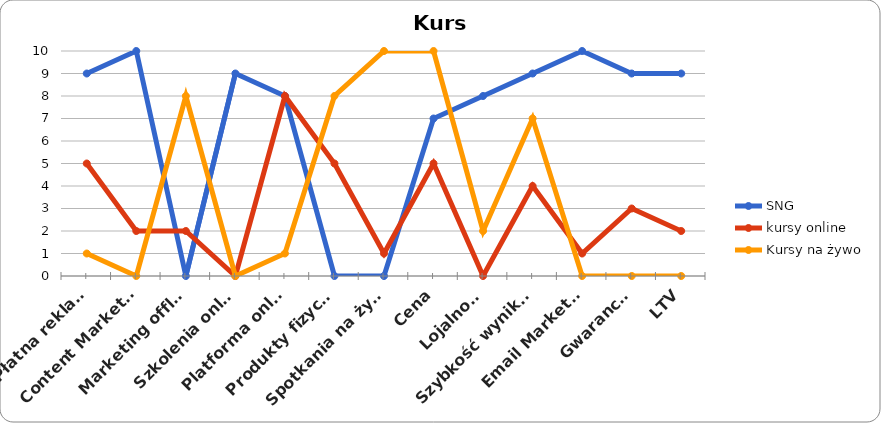
| Category | SNG | kursy online | Kursy na żywo |
|---|---|---|---|
| Płatna reklama | 9 | 5 | 1 |
| Content Marketing | 10 | 2 | 0 |
| Marketing offline | 0 | 2 | 8 |
| Szkolenia online | 9 | 0 | 0 |
| Platforma online | 8 | 8 | 1 |
| Produkty fizyczne | 0 | 5 | 8 |
| Spotkania na żywo | 0 | 1 | 10 |
| Cena | 7 | 5 | 10 |
| Lojalność | 8 | 0 | 2 |
| Szybkość wyników | 9 | 4 | 7 |
| Email Marketing | 10 | 1 | 0 |
| Gwarancja | 9 | 3 | 0 |
| LTV | 9 | 2 | 0 |